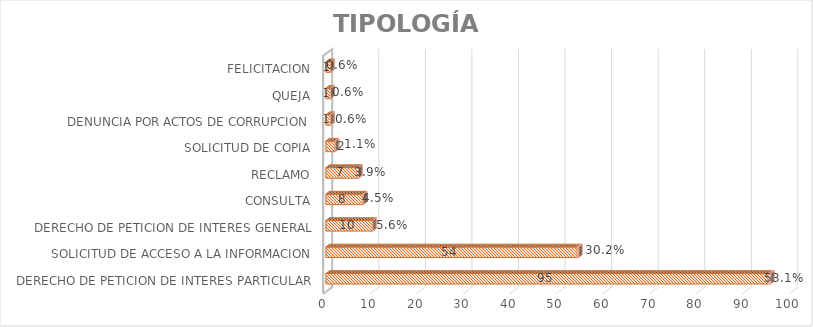
| Category | Cuenta de Número petición | Cuenta de Número petición2 |
|---|---|---|
| DERECHO DE PETICION DE INTERES PARTICULAR | 95 | 0.531 |
| SOLICITUD DE ACCESO A LA INFORMACION | 54 | 0.302 |
| DERECHO DE PETICION DE INTERES GENERAL | 10 | 0.056 |
| CONSULTA | 8 | 0.045 |
| RECLAMO | 7 | 0.039 |
| SOLICITUD DE COPIA | 2 | 0.011 |
| DENUNCIA POR ACTOS DE CORRUPCION | 1 | 0.006 |
| QUEJA | 1 | 0.006 |
| FELICITACION | 1 | 0.006 |